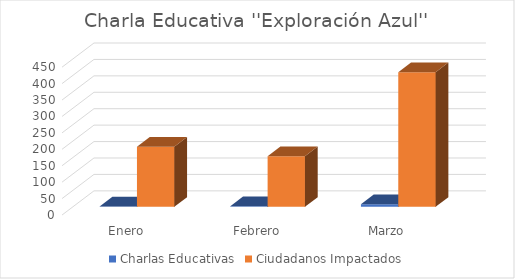
| Category | Charlas Educativas | Ciudadanos Impactados |
|---|---|---|
| Enero | 1 | 183 |
| Febrero | 2 | 154 |
| Marzo | 8 | 410 |